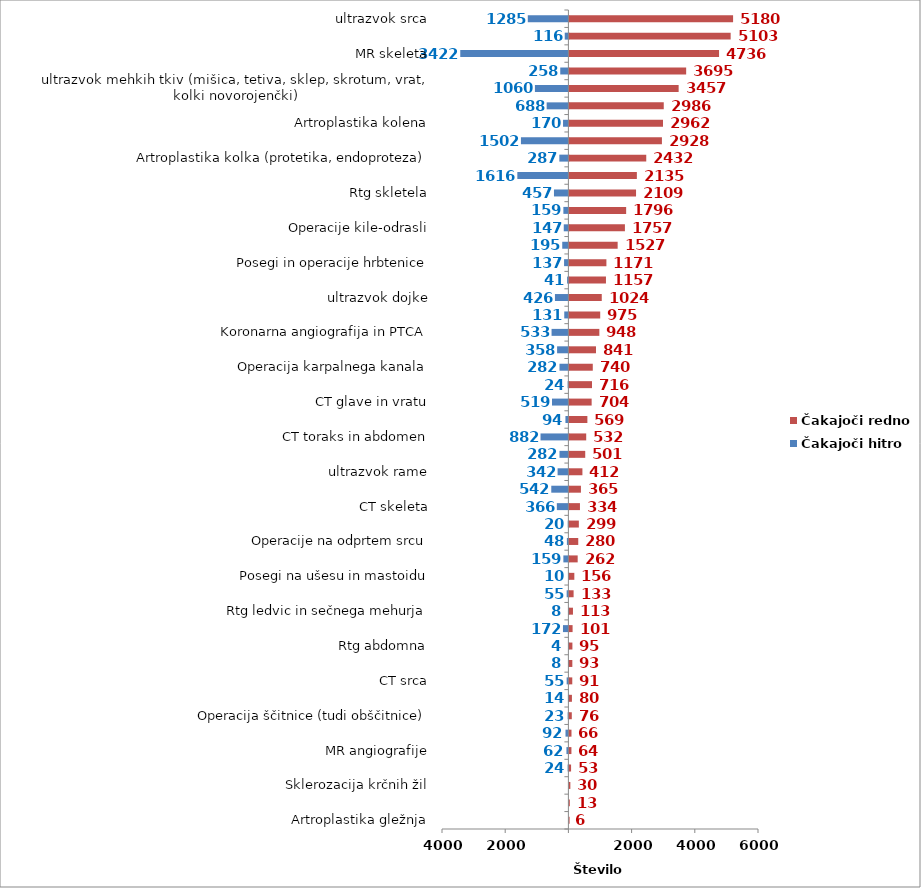
| Category | Čakajoči hitro | Čakajoči redno |
|---|---|---|
| Artroplastika gležnja | 0 | 6 |
| Operacije kile-otroci | 0 | 13 |
| Sklerozacija krčnih žil | 0 | 30 |
| PTA (perkutana transluminalna angioplastika) | -24 | 53 |
| MR angiografije | -62 | 64 |
| Angiografija (brez koronarne angiografije) | -92 | 66 |
| Operacija ščitnice (tudi obščitnice) | -23 | 76 |
| MR srca | -14 | 80 |
| CT srca | -55 | 91 |
| Posegi na arterijah (brez PTA) | -8 | 93 |
| Rtg abdomna | -4 | 95 |
| MR toraks in abdomen | -172 | 101 |
| Rtg ledvic in sečnega mehurja | -8 | 113 |
| Rtg glave | -55 | 133 |
| Posegi na ušesu in mastoidu | -10 | 156 |
| Elektroencefalografija (EEG) | -159 | 262 |
| Operacije na odprtem srcu | -48 | 280 |
| Drugi posegi na perifernem ožilju | -20 | 299 |
| CT skeleta | -366 | 334 |
| CT angiografije | -542 | 365 |
| ultrazvok rame | -342 | 412 |
| Rtg mamografija | -282 | 501 |
| CT toraks in abdomen | -882 | 532 |
| Ortopedska operacija rame (samo terapevstki posegi na rami) | -94 | 569 |
| CT glave in vratu | -519 | 704 |
| Rtg PC | -24 | 716 |
| Operacija karpalnega kanala | -282 | 740 |
| Rtg hrbtenice | -358 | 841 |
| Koronarna angiografija in PTCA | -533 | 948 |
| Operacije žolčnih kamnov | -131 | 975 |
| ultrazvok dojke | -426 | 1024 |
| Posegi in operacije nosu in obnosnih votlin | -41 | 1157 |
| Posegi in operacije hrbtenice | -137 | 1171 |
| Terapevtske artroskopije (kolenske križne vezi, kolena) | -195 | 1527 |
| Operacije kile-odrasli | -147 | 1757 |
| Posegi in operacije v ustih, grlu in žrelu | -159 | 1796 |
| Rtg skletela | -457 | 2109 |
| MR glave in vratu | -1616 | 2135 |
| Artroplastika kolka (protetika, endoproteza) | -287 | 2432 |
| Elektromiografija (EMG) | -1502 | 2928 |
| Artroplastika kolena | -170 | 2962 |
| ultrazvok vratnih žil | -688 | 2986 |
| ultrazvok mehkih tkiv (mišica, tetiva, sklep, skrotum, vrat, kolki novorojenčki) | -1060 | 3457 |
| Operacija sive mrene (katarakta) | -258 | 3695 |
| MR skeleta | -3422 | 4736 |
| Operacije krčnih žil | -116 | 5103 |
| ultrazvok srca | -1285 | 5180 |